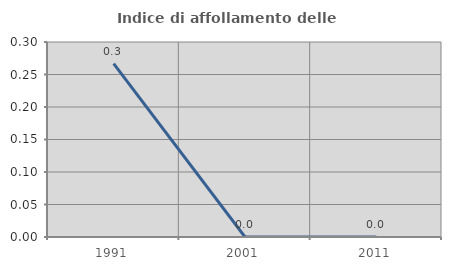
| Category | Indice di affollamento delle abitazioni  |
|---|---|
| 1991.0 | 0.267 |
| 2001.0 | 0 |
| 2011.0 | 0 |